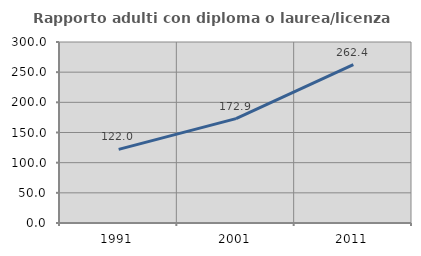
| Category | Rapporto adulti con diploma o laurea/licenza media  |
|---|---|
| 1991.0 | 122.046 |
| 2001.0 | 172.929 |
| 2011.0 | 262.408 |